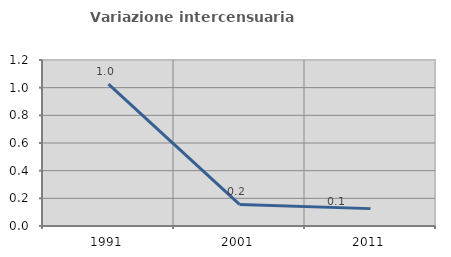
| Category | Variazione intercensuaria annua |
|---|---|
| 1991.0 | 1.026 |
| 2001.0 | 0.156 |
| 2011.0 | 0.126 |